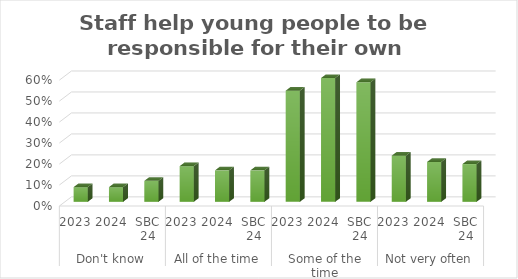
| Category | Staff help young people to be responsible for their own behaviour. |
|---|---|
| 0 | 0.07 |
| 1 | 0.07 |
| 2 | 0.1 |
| 3 | 0.17 |
| 4 | 0.15 |
| 5 | 0.15 |
| 6 | 0.53 |
| 7 | 0.59 |
| 8 | 0.57 |
| 9 | 0.22 |
| 10 | 0.19 |
| 11 | 0.18 |